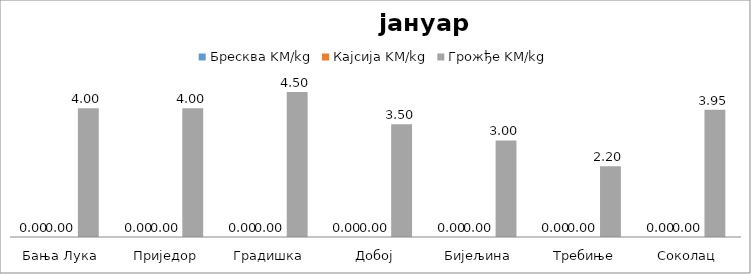
| Category | Бресква KM/kg | Кајсија KM/kg | Грожђе KM/kg |
|---|---|---|---|
| Бања Лука | 0 | 0 | 4 |
| Приједор | 0 | 0 | 4 |
| Градишка | 0 | 0 | 4.5 |
| Добој | 0 | 0 | 3.5 |
| Бијељина | 0 | 0 | 3 |
|  Требиње | 0 | 0 | 2.2 |
| Соколац | 0 | 0 | 3.95 |